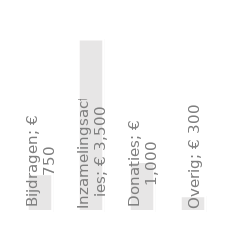
| Category | Jaarinkomsten |
|---|---|
| Bijdragen | 750 |
| Inzamelingsacties | 3500 |
| Donaties | 1000 |
| Overig | 300 |